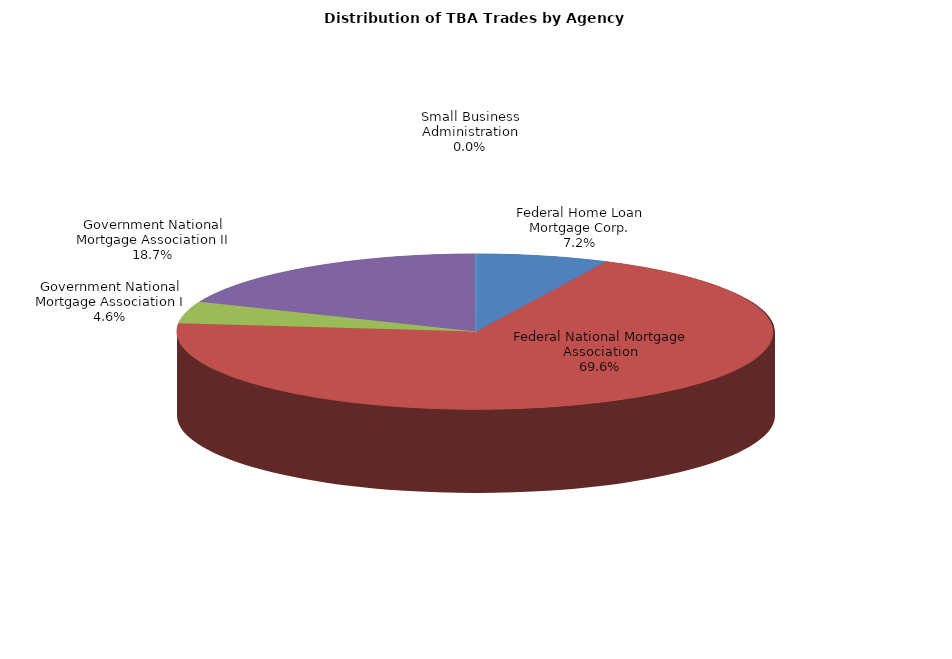
| Category | Series 0 |
|---|---|
| Federal Home Loan Mortgage Corp. | 537.194 |
| Federal National Mortgage Association | 5221.119 |
| Government National Mortgage Association I | 343.544 |
| Government National Mortgage Association II | 1403.492 |
| Small Business Administration | 1.04 |